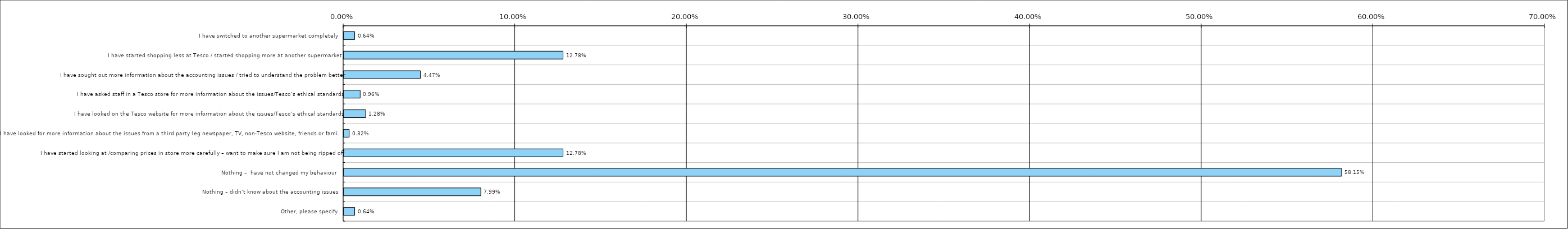
| Category | Total(United Kingdom) |
|---|---|
| I have switched to another supermarket completely  | 0.006 |
| I have started shopping less at Tesco / started shopping more at another supermarket  | 0.128 |
| I have sought out more information about the accounting issues / tried to understand the problem better | 0.045 |
| I have asked staff in a Tesco store for more information about the issues/Tesco’s ethical standards | 0.01 |
| I have looked on the Tesco website for more information about the issues/Tesco’s ethical standards | 0.013 |
| I have looked for more information about the issues from a third party (eg newspaper, TV, non-Tesco website, friends or family) | 0.003 |
| I have started looking at /comparing prices in store more carefully – want to make sure I am not being ripped off | 0.128 |
| Nothing –  have not changed my behaviour  | 0.582 |
| Nothing – didn’t know about the accounting issues  | 0.08 |
| Other, please specify | 0.006 |